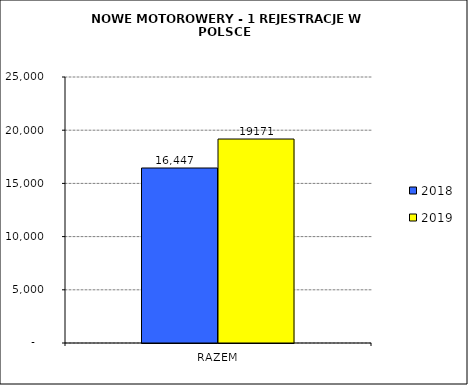
| Category | 2018 | 2019 |
|---|---|---|
| RAZEM | 16447 | 19171 |